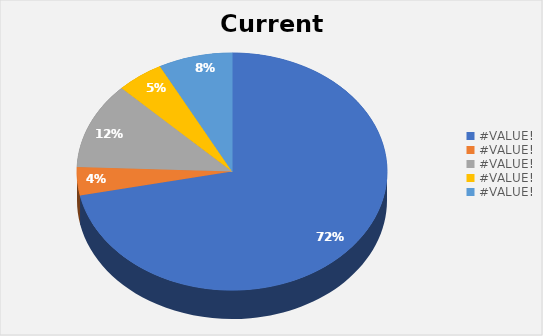
| Category | Current Investment |
|---|---|
| RELIANCE INDUSTRIES LIMITED (XNSE:RELIANCE) | 14000 |
| TATA CONSULTANCY SERVICES LIMITED (XNSE:TCS) | 750 |
| HDFC BANK LIMITED (XNSE:HDFCBANK) | 2300 |
| INFOSYS LIMITED (XNSE:INFY) | 960 |
| State Bank of India (XNSE:SBIN) | 1500 |